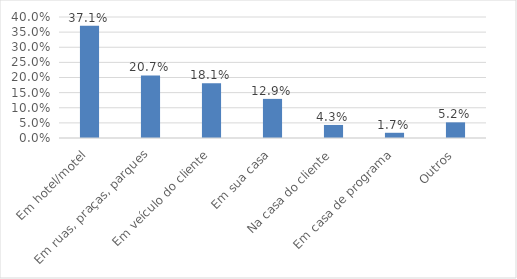
| Category | Series 0 |
|---|---|
| Em hotel/motel | 0.371 |
| Em ruas, praças, parques | 0.207 |
| Em veículo do cliente | 0.181 |
| Em sua casa | 0.129 |
| Na casa do cliente | 0.043 |
| Em casa de programa | 0.017 |
| Outros | 0.052 |